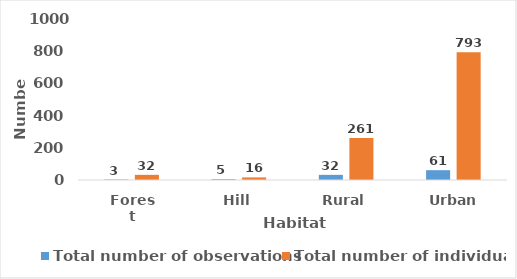
| Category | Total number of observations | Total number of individuals |
|---|---|---|
| Forest | 3 | 32 |
| Hill | 5 | 16 |
| Rural | 32 | 261 |
| Urban | 61 | 793 |